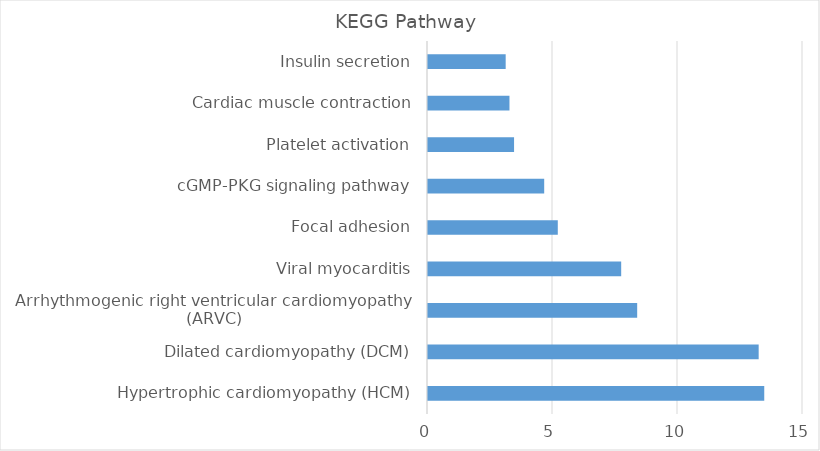
| Category | Bejamini2 |
|---|---|
| Hypertrophic cardiomyopathy (HCM) | 13.45 |
| Dilated cardiomyopathy (DCM) | 13.227 |
| Arrhythmogenic right ventricular cardiomyopathy (ARVC) | 8.367 |
| Viral myocarditis | 7.727 |
| Focal adhesion | 5.191 |
| cGMP-PKG signaling pathway | 4.648 |
| Platelet activation | 3.442 |
| Cardiac muscle contraction | 3.258 |
| Insulin secretion | 3.107 |